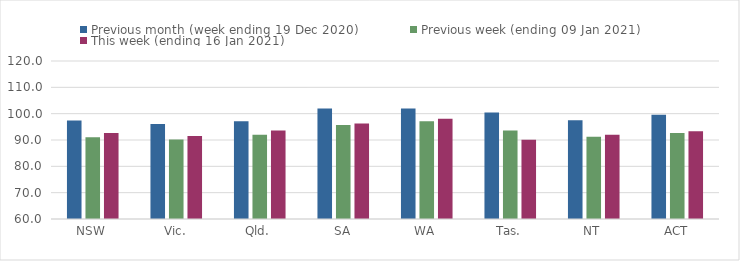
| Category | Previous month (week ending 19 Dec 2020) | Previous week (ending 09 Jan 2021) | This week (ending 16 Jan 2021) |
|---|---|---|---|
| NSW | 97.44 | 91 | 92.69 |
| Vic. | 96.08 | 90.15 | 91.55 |
| Qld. | 97.13 | 91.98 | 93.64 |
| SA | 101.97 | 95.7 | 96.25 |
| WA | 101.94 | 97.12 | 98.06 |
| Tas. | 100.49 | 93.58 | 90.06 |
| NT | 97.51 | 91.25 | 91.98 |
| ACT | 99.57 | 92.7 | 93.36 |